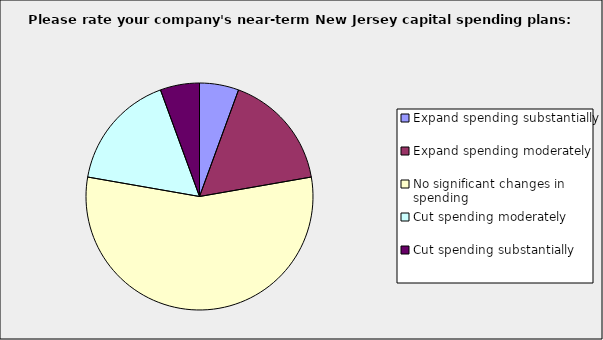
| Category | Series 0 |
|---|---|
| Expand spending substantially | 0.056 |
| Expand spending moderately | 0.167 |
| No significant changes in spending | 0.556 |
| Cut spending moderately | 0.167 |
| Cut spending substantially | 0.056 |